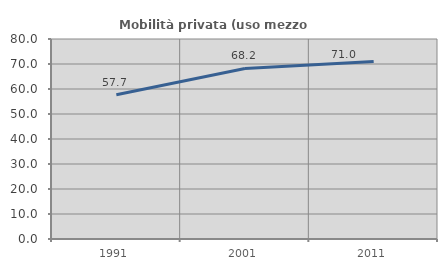
| Category | Mobilità privata (uso mezzo privato) |
|---|---|
| 1991.0 | 57.727 |
| 2001.0 | 68.229 |
| 2011.0 | 70.988 |